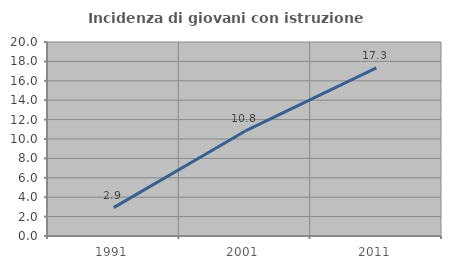
| Category | Incidenza di giovani con istruzione universitaria |
|---|---|
| 1991.0 | 2.922 |
| 2001.0 | 10.802 |
| 2011.0 | 17.329 |